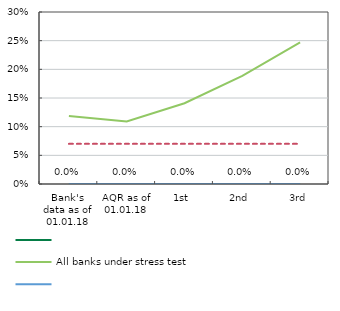
| Category | Series 0 | All banks under stress test | Series 3 | Required level of core capital ratio under baseline scenario |
|---|---|---|---|---|
| Bank's data as of 01.01.18 | 0 | 0.119 | 0 | 0.07 |
| AQR as of 01.01.18 | 0 | 0.109 | 0 | 0.07 |
| 1st | 0 | 0.141 | 0 | 0.07 |
| 2nd | 0 | 0.189 | 0 | 0.07 |
| 3rd | 0 | 0.247 | 0 | 0.07 |